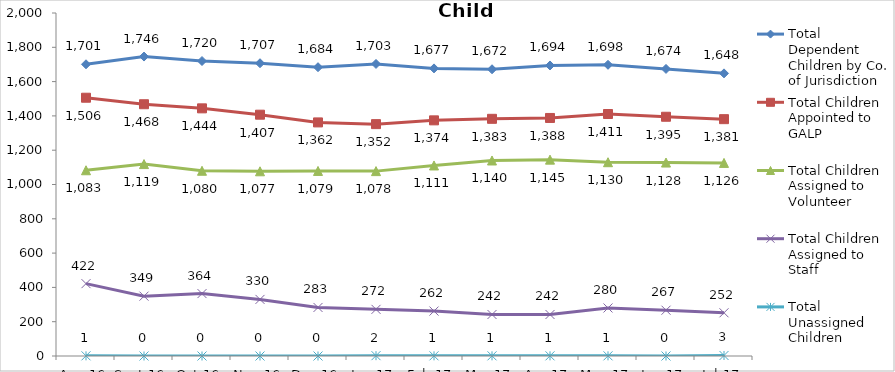
| Category | Total Dependent Children by Co. of Jurisdiction | Total Children Appointed to GALP | Total Children Assigned to Volunteer | Total Children Assigned to Staff | Total Unassigned Children |
|---|---|---|---|---|---|
| Aug-16 | 1701 | 1506 | 1083 | 422 | 1 |
| Sep-16 | 1746 | 1468 | 1119 | 349 | 0 |
| Oct-16 | 1720 | 1444 | 1080 | 364 | 0 |
| Nov-16 | 1707 | 1407 | 1077 | 330 | 0 |
| Dec-16 | 1684 | 1362 | 1079 | 283 | 0 |
| Jan-17 | 1703 | 1352 | 1078 | 272 | 2 |
| Feb-17 | 1677 | 1374 | 1111 | 262 | 1 |
| Mar-17 | 1672 | 1383 | 1140 | 242 | 1 |
| Apr-17 | 1694 | 1388 | 1145 | 242 | 1 |
| May-17 | 1698 | 1411 | 1130 | 280 | 1 |
| Jun-17 | 1674 | 1395 | 1128 | 267 | 0 |
| Jul-17 | 1648 | 1381 | 1126 | 252 | 3 |